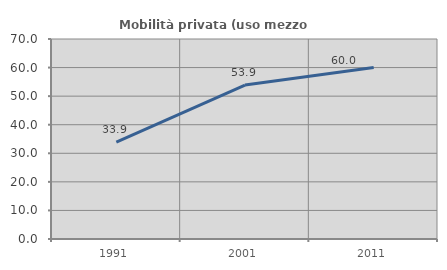
| Category | Mobilità privata (uso mezzo privato) |
|---|---|
| 1991.0 | 33.934 |
| 2001.0 | 53.895 |
| 2011.0 | 60.036 |